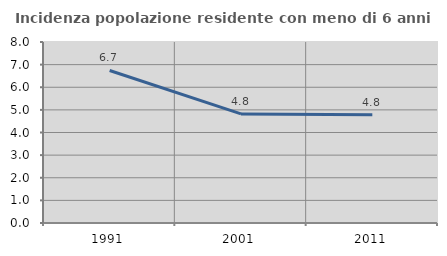
| Category | Incidenza popolazione residente con meno di 6 anni |
|---|---|
| 1991.0 | 6.741 |
| 2001.0 | 4.821 |
| 2011.0 | 4.786 |